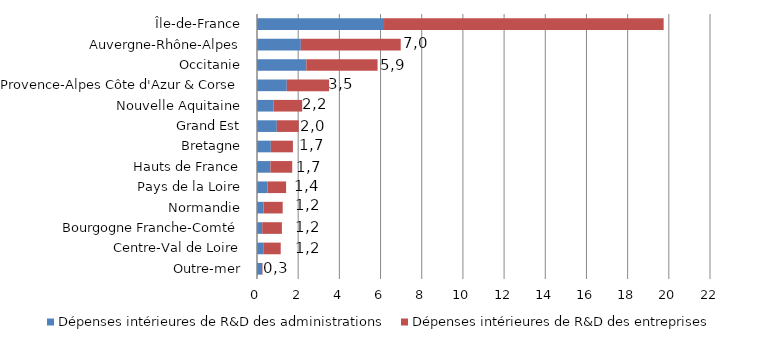
| Category | Dépenses intérieures de R&D des administrations | Dépenses intérieures de R&D des entreprises |
|---|---|---|
| Outre-mer | 250.016 | 20.922 |
| Centre-Val de Loire | 304.726 | 847.17 |
| Bourgogne Franche-Comté | 251.995 | 956.689 |
| Normandie | 315.627 | 931.363 |
| Pays de la Loire | 511.155 | 901.923 |
| Hauts de France | 652.118 | 1058.467 |
| Bretagne | 670.685 | 1073.58 |
| Grand Est | 961.992 | 1065.131 |
| Nouvelle Aquitaine | 810.007 | 1383.723 |
| Provence-Alpes Côte d'Azur & Corse | 1446.126 | 2054.118 |
| Occitanie | 2396.917 | 3458.602 |
| Auvergne-Rhône-Alpes | 2128.394 | 4850.816 |
| Île-de-France | 6170.207 | 13578.975 |